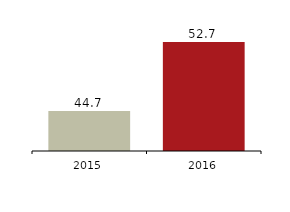
| Category | Total operating income |
|---|---|
| 2016.0 | 52716 |
| 2015.0 | 44673 |